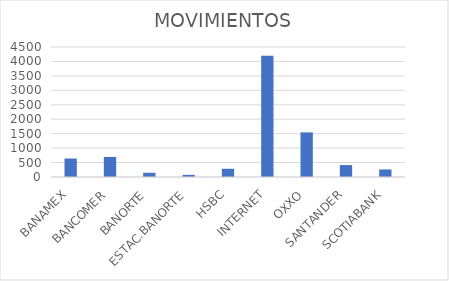
| Category | MOVIMIENTOS |
|---|---|
| BANAMEX | 640 |
| BANCOMER | 695 |
| BANORTE | 147 |
| ESTAC.BANORTE | 74 |
| HSBC | 285 |
| INTERNET | 4201 |
| OXXO | 1544 |
| SANTANDER | 412 |
| SCOTIABANK | 261 |